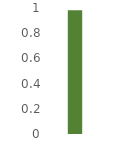
| Category | #¡REF! |
|---|---|
| Avance | 0.982 |